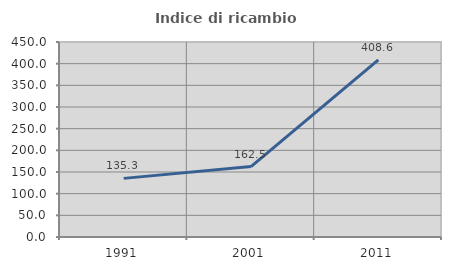
| Category | Indice di ricambio occupazionale  |
|---|---|
| 1991.0 | 135.294 |
| 2001.0 | 162.5 |
| 2011.0 | 408.621 |